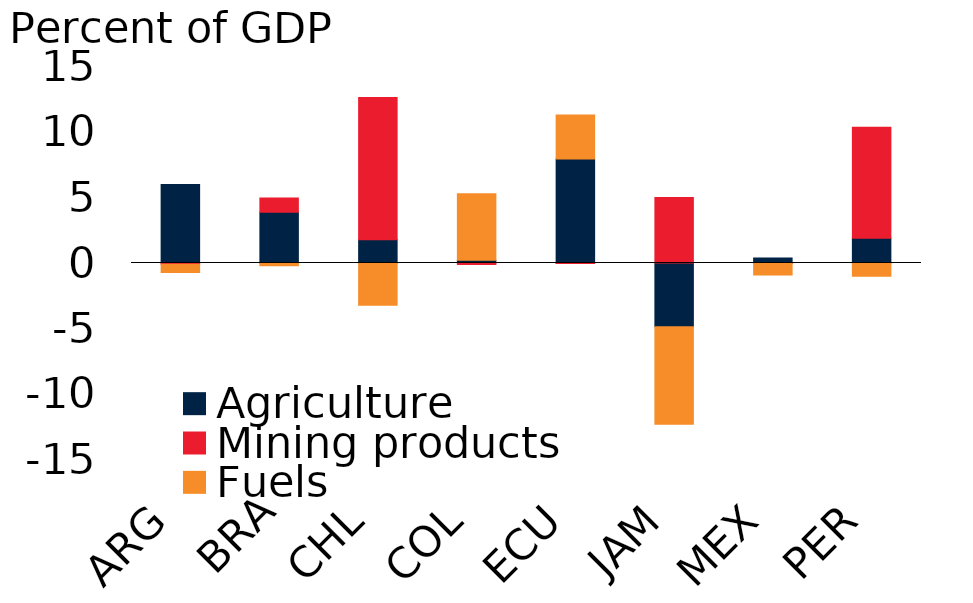
| Category | Agriculture | Mining products | Fuels |
|---|---|---|---|
| ARG | 6.001 | -0.092 | -0.633 |
| BRA | 3.874 | 1.096 | -0.207 |
| CHL | 1.782 | 10.854 | -3.225 |
| COL | 0.218 | -0.122 | 5.073 |
| ECU | 7.947 | -0.036 | 3.347 |
| JAM | -4.861 | 4.995 | -7.455 |
| MEX | 0.385 | -0.045 | -0.871 |
| PER | 1.89 | 8.465 | -1.011 |